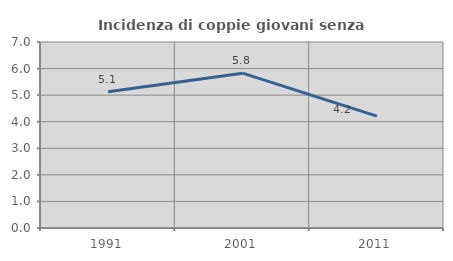
| Category | Incidenza di coppie giovani senza figli |
|---|---|
| 1991.0 | 5.127 |
| 2001.0 | 5.827 |
| 2011.0 | 4.212 |